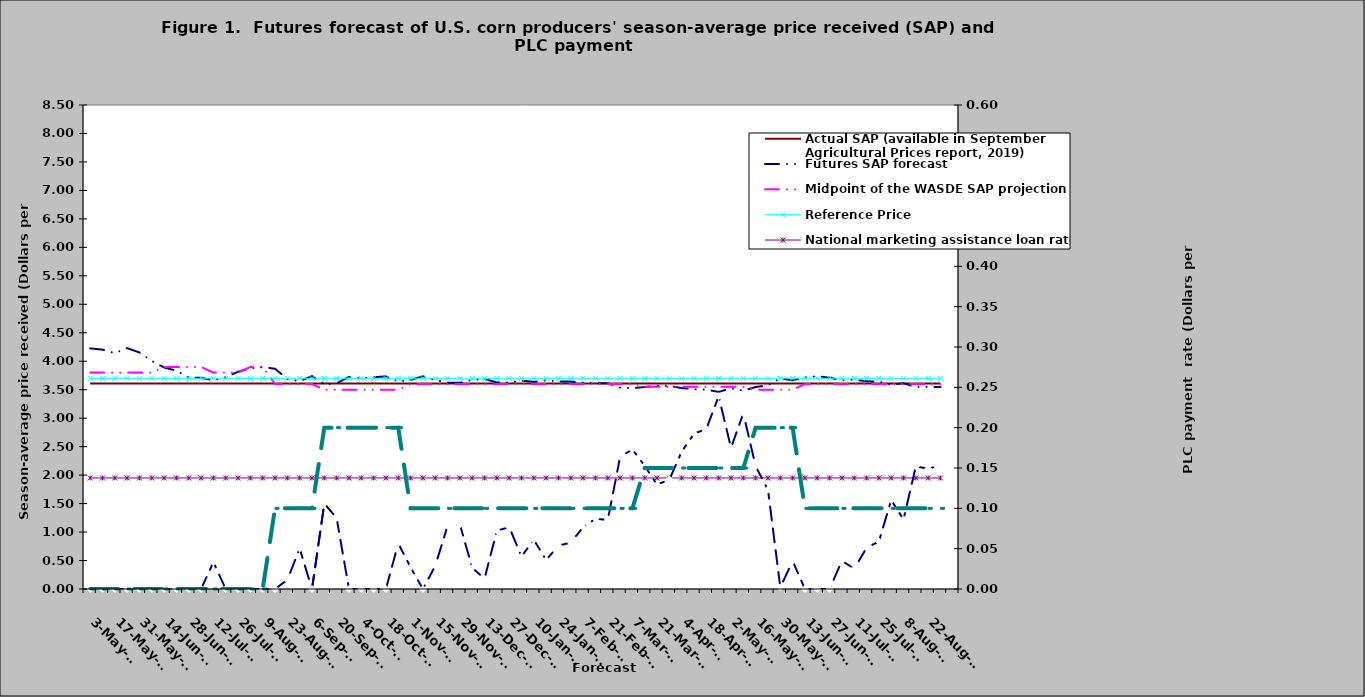
| Category | Actual SAP (available in September Agricultural Prices report, 2019) | Futures SAP forecast | Midpoint of the WASDE SAP projection | Reference Price | National marketing assistance loan rate  |
|---|---|---|---|---|---|
| 2018-05-03 | 3.61 | 4.226 | 3.8 | 3.7 | 1.95 |
| 2018-05-10 | 3.61 | 4.203 | 3.8 | 3.7 | 1.95 |
| 2018-05-17 | 3.61 | 4.142 | 3.8 | 3.7 | 1.95 |
| 2018-05-24 | 3.61 | 4.23 | 3.8 | 3.7 | 1.95 |
| 2018-05-31 | 3.61 | 4.154 | 3.8 | 3.7 | 1.95 |
| 2018-06-07 | 3.61 | 4.005 | 3.8 | 3.7 | 1.95 |
| 2018-06-14 | 3.61 | 3.89 | 3.9 | 3.7 | 1.95 |
| 2018-06-21 | 3.61 | 3.834 | 3.9 | 3.7 | 1.95 |
| 2018-06-28 | 3.61 | 3.714 | 3.9 | 3.7 | 1.95 |
| 2018-07-05 | 3.61 | 3.709 | 3.9 | 3.7 | 1.95 |
| 2018-07-12 | 3.61 | 3.667 | 3.8 | 3.7 | 1.95 |
| 2018-07-19 | 3.61 | 3.72 | 3.8 | 3.7 | 1.95 |
| 2018-07-26 | 3.61 | 3.816 | 3.8 | 3.7 | 1.95 |
| 2018-08-02 | 3.61 | 3.876 | 3.9 | 3.7 | 1.95 |
| 2018-08-09 | 3.61 | 3.895 | 3.9 | 3.7 | 1.95 |
| 2018-08-16 | 3.61 | 3.868 | 3.6 | 3.7 | 1.95 |
| 2018-08-23 | 3.61 | 3.689 | 3.6 | 3.7 | 1.95 |
| 2018-08-30 | 3.61 | 3.65 | 3.6 | 3.7 | 1.95 |
| 2018-09-06 | 3.61 | 3.739 | 3.6 | 3.7 | 1.95 |
| 2018-09-13 | 3.61 | 3.594 | 3.5 | 3.7 | 1.95 |
| 2018-09-20 | 3.61 | 3.612 | 3.5 | 3.7 | 1.95 |
| 2018-09-27 | 3.61 | 3.725 | 3.5 | 3.7 | 1.95 |
| 2018-10-04 | 3.61 | 3.7 | 3.5 | 3.7 | 1.95 |
| 2018-10-11 | 3.61 | 3.719 | 3.5 | 3.7 | 1.95 |
| 2018-10-18 | 3.61 | 3.734 | 3.5 | 3.7 | 1.95 |
| 2018-10-25 | 3.61 | 3.643 | 3.5 | 3.7 | 1.95 |
| 2018-11-01 | 3.61 | 3.673 | 3.6 | 3.7 | 1.95 |
| 2018-11-08 | 3.61 | 3.735 | 3.6 | 3.7 | 1.95 |
| 2018-11-15 | 3.61 | 3.671 | 3.6 | 3.7 | 1.95 |
| 2018-11-22 | 3.61 | 3.622 | 3.6 | 3.7 | 1.95 |
| 2018-11-29 | 3.61 | 3.62 | 3.6 | 3.7 | 1.95 |
| 2018-12-06 | 3.61 | 3.674 | 3.6 | 3.7 | 1.95 |
| 2018-12-13 | 3.61 | 3.687 | 3.6 | 3.7 | 1.95 |
| 2018-12-20 | 3.61 | 3.628 | 3.6 | 3.7 | 1.95 |
| 2018-12-27 | 3.61 | 3.623 | 3.6 | 3.7 | 1.95 |
| 2019-01-03 | 3.61 | 3.66 | 3.6 | 3.7 | 1.95 |
| 2019-01-10 | 3.61 | 3.639 | 3.6 | 3.7 | 1.95 |
| 2019-01-17 | 3.61 | 3.664 | 3.6 | 3.7 | 1.95 |
| 2019-01-24 | 3.61 | 3.646 | 3.6 | 3.7 | 1.95 |
| 2019-01-31 | 3.61 | 3.642 | 3.6 | 3.7 | 1.95 |
| 2019-02-07 | 3.61 | 3.623 | 3.6 | 3.7 | 1.95 |
| 2019-02-14 | 3.61 | 3.613 | 3.6 | 3.7 | 1.95 |
| 2019-02-21 | 3.61 | 3.614 | 3.6 | 3.7 | 1.95 |
| 2019-02-28 | 3.61 | 3.536 | 3.6 | 3.7 | 1.95 |
| 2019-03-07 | 3.61 | 3.527 | 3.6 | 3.7 | 1.95 |
| 2019-03-14 | 3.61 | 3.547 | 3.55 | 3.7 | 1.95 |
| 2019-03-21 | 3.61 | 3.571 | 3.55 | 3.7 | 1.95 |
| 2019-03-28 | 3.61 | 3.564 | 3.55 | 3.7 | 1.95 |
| 2019-04-04 | 3.61 | 3.53 | 3.55 | 3.7 | 1.95 |
| 2019-04-11 | 3.61 | 3.508 | 3.55 | 3.7 | 1.95 |
| 2019-04-18 | 3.61 | 3.502 | 3.55 | 3.7 | 1.95 |
| 2019-04-25 | 3.61 | 3.461 | 3.55 | 3.7 | 1.95 |
| 2019-05-02 | 3.61 | 3.525 | 3.55 | 3.7 | 1.95 |
| 2019-05-09 | 3.61 | 3.482 | 3.55 | 3.7 | 1.95 |
| 2019-05-16 | 3.61 | 3.548 | 3.5 | 3.7 | 1.95 |
| 2019-05-23 | 3.61 | 3.577 | 3.5 | 3.7 | 1.95 |
| 2019-05-30 | 3.61 | 3.698 | 3.5 | 3.7 | 1.95 |
| 2019-06-06 | 3.61 | 3.665 | 3.5 | 3.7 | 1.95 |
| 2019-06-13 | 3.61 | 3.717 | 3.6 | 3.7 | 1.95 |
| 2019-06-20 | 3.61 | 3.736 | 3.6 | 3.7 | 1.95 |
| 2019-06-27 | 3.61 | 3.712 | 3.6 | 3.7 | 1.95 |
| 2019-07-04 | 3.61 | 3.665 | 3.6 | 3.7 | 1.95 |
| 2019-07-11 | 3.61 | 3.675 | 3.6 | 3.7 | 1.95 |
| 2019-07-18 | 3.61 | 3.649 | 3.6 | 3.7 | 1.95 |
| 2019-07-25 | 3.61 | 3.641 | 3.6 | 3.7 | 1.95 |
| 2019-08-01 | 3.61 | 3.59 | 3.6 | 3.7 | 1.95 |
| 2019-08-08 | 3.61 | 3.614 | 3.6 | 3.7 | 1.95 |
| 2019-08-15 | 3.61 | 3.548 | 3.6 | 3.7 | 1.95 |
| 2019-08-22 | 3.61 | 3.551 | 3.6 | 3.7 | 1.95 |
| 2019-08-29 | 3.61 | 3.546 | 3.6 | 3.7 | 1.95 |